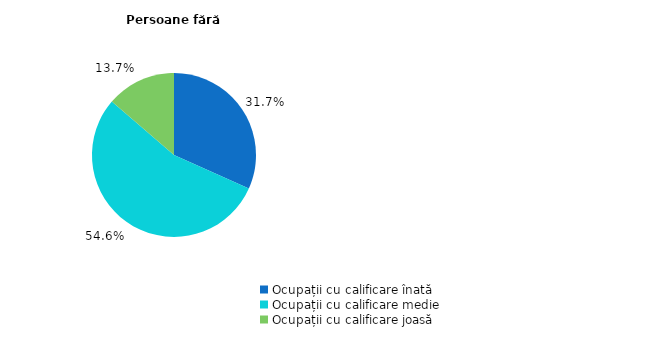
| Category | Persoane fără dizabilități |
|---|---|
| Ocupații cu calificare înată | 31.7 |
| Ocupații cu calificare medie | 54.6 |
| Ocupații cu calificare joasă | 13.7 |